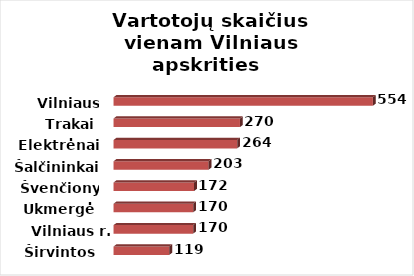
| Category | Series 0 |
|---|---|
| Širvintos | 119 |
| Vilniaus r. | 170 |
| Ukmergė | 170 |
| Švenčionys | 172 |
| Šalčininkai | 203 |
| Elektrėnai | 264 |
| Trakai | 270 |
| Vilniaus m. | 554 |